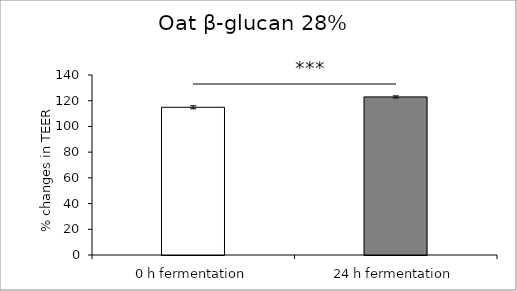
| Category | average |
|---|---|
| 0 h fermentation | 114.898 |
| 24 h fermentation | 122.963 |